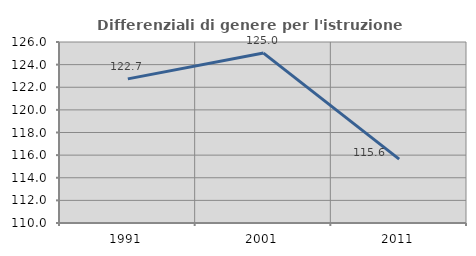
| Category | Differenziali di genere per l'istruzione superiore |
|---|---|
| 1991.0 | 122.741 |
| 2001.0 | 125.022 |
| 2011.0 | 115.642 |